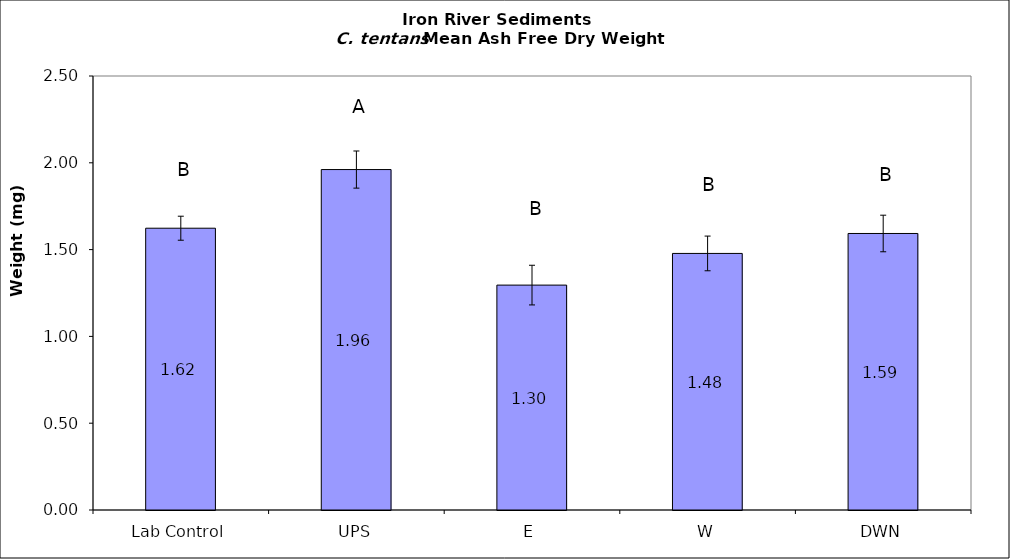
| Category | Series 0 |
|---|---|
| Lab Control | 1.623 |
| UPS | 1.961 |
| E | 1.296 |
| W | 1.478 |
| DWN | 1.593 |